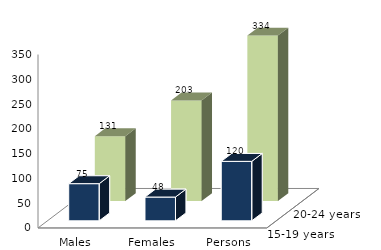
| Category | 15-19 years | 20-24 years |
|---|---|---|
| Males | 75 | 131 |
| Females | 48 | 203 |
| Persons | 120 | 334 |